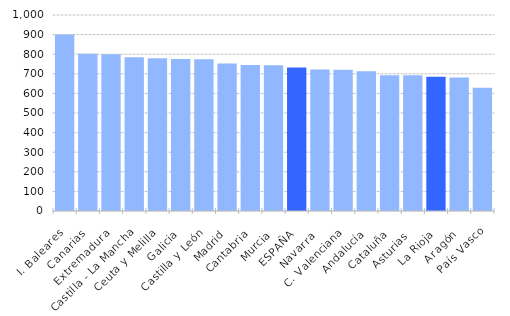
| Category | Series 1 |
|---|---|
| I. Baleares | 900.516 |
| Canarias | 802.303 |
| Extremadura | 799.665 |
| Castilla - La Mancha | 784.542 |
| Ceuta y Melilla | 778.781 |
| Galicia | 776.118 |
| Castilla y León | 774.299 |
| Madrid | 752.035 |
| Cantabria | 745.003 |
| Murcia | 743.097 |
| ESPAÑA | 732.658 |
| Navarra  | 721.491 |
| C. Valenciana | 720.22 |
| Andalucía | 713.191 |
| Cataluña | 692.426 |
| Asturias  | 692.218 |
| La Rioja | 684.403 |
| Aragón | 681.201 |
| País Vasco | 628.236 |